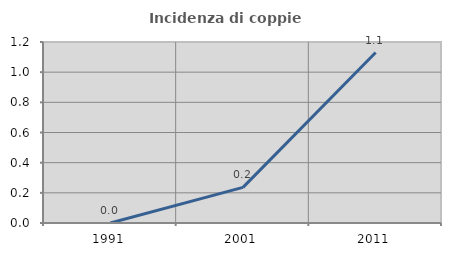
| Category | Incidenza di coppie miste |
|---|---|
| 1991.0 | 0 |
| 2001.0 | 0.236 |
| 2011.0 | 1.13 |